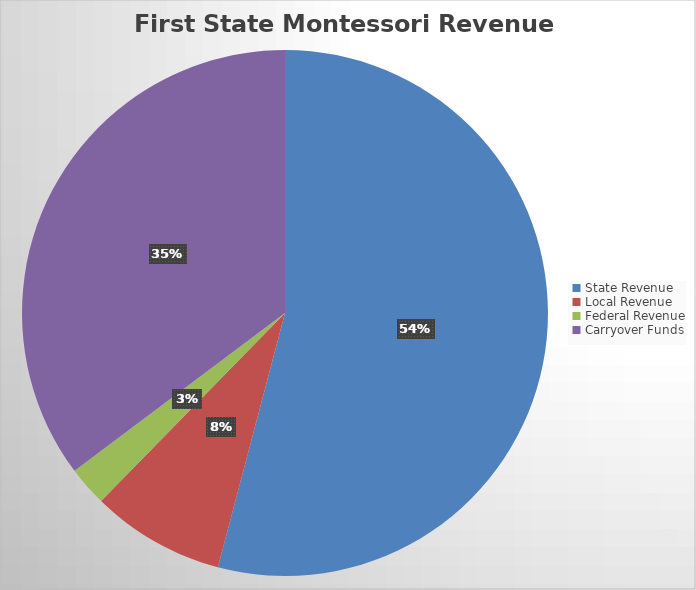
| Category | Series 0 |
|---|---|
| State Revenue | 4559405 |
| Local Revenue | 692403.71 |
| Federal Revenue | 205652 |
| Carryover Funds | 2969055.99 |